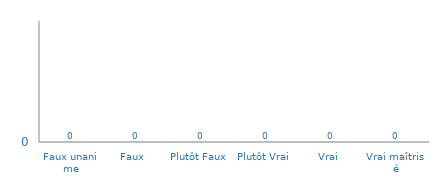
| Category | Histogramme de Véracité BM02 |
|---|---|
| Faux unanime | 0 |
| Faux  | 0 |
| Plutôt Faux | 0 |
| Plutôt Vrai | 0 |
| Vrai  | 0 |
| Vrai maîtrisé | 0 |